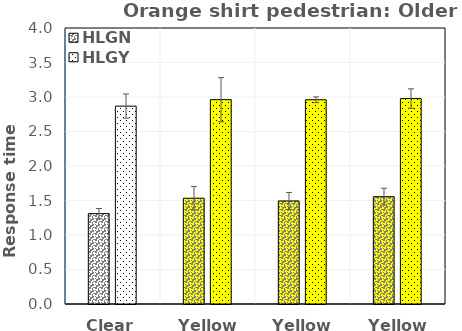
| Category | HLGN | HLGY |
|---|---|---|
| Clear | 1.31 | 2.868 |
| Yellow1 | 1.533 | 2.961 |
| Yellow2 | 1.494 | 2.96 |
| Yellow3 | 1.555 | 2.977 |